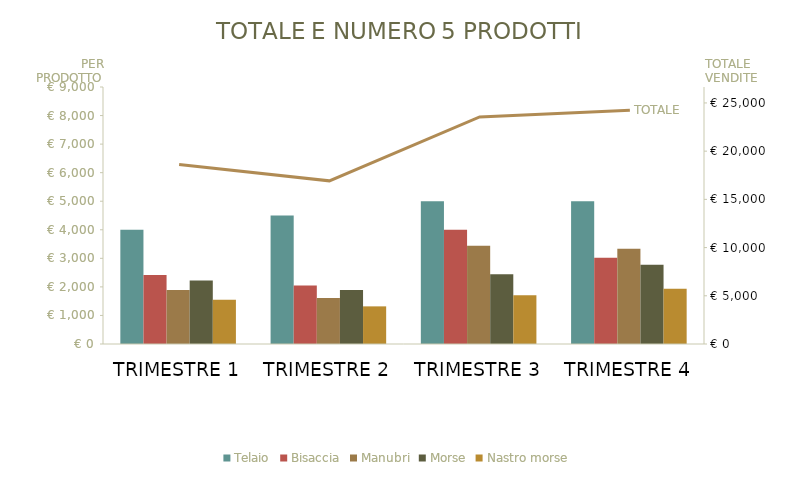
| Category | Telaio | Bisaccia | Manubri | Morse | Nastro morse |
|---|---|---|---|---|---|
| TRIMESTRE 1 | 4000 | 2413 | 1895 | 2222 | 1550.4 |
| TRIMESTRE 2 | 4500 | 2051.05 | 1610.75 | 1888.7 | 1317.84 |
| TRIMESTRE 3 | 5000 | 4000 | 3445 | 2444.2 | 1705.44 |
| TRIMESTRE 4 | 5000 | 3016.25 | 3333 | 2777.5 | 1938 |